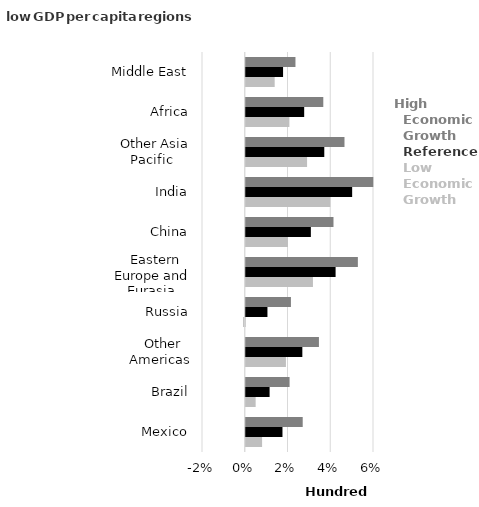
| Category | Low Economic Growth case | Reference case | High Economic Growth case |
|---|---|---|---|
|   Mexico | 0.765 | 1.718 | 2.665 |
|   Brazil | 0.463 | 1.116 | 2.051 |
|   Other Americas | 1.88 | 2.648 | 3.424 |
|   Russia | -0.078 | 1.015 | 2.114 |
|   Eastern Europe and Eurasia | 3.144 | 4.203 | 5.245 |
|   China | 1.974 | 3.046 | 4.104 |
|   India | 3.957 | 4.978 | 5.967 |
|   Other Asia Pacific | 2.869 | 3.674 | 4.619 |
|   Africa | 2.042 | 2.734 | 3.628 |
|   Middle East | 1.354 | 1.746 | 2.326 |